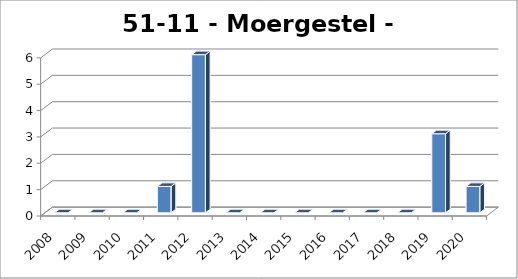
| Category | Moergestel - Oisterwijk |
|---|---|
| 2008.0 | 0 |
| 2009.0 | 0 |
| 2010.0 | 0 |
| 2011.0 | 1 |
| 2012.0 | 6 |
| 2013.0 | 0 |
| 2014.0 | 0 |
| 2015.0 | 0 |
| 2016.0 | 0 |
| 2017.0 | 0 |
| 2018.0 | 0 |
| 2019.0 | 3 |
| 2020.0 | 1 |